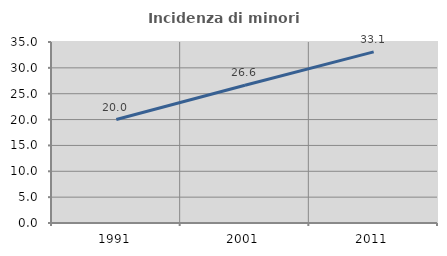
| Category | Incidenza di minori stranieri |
|---|---|
| 1991.0 | 20 |
| 2001.0 | 26.636 |
| 2011.0 | 33.086 |